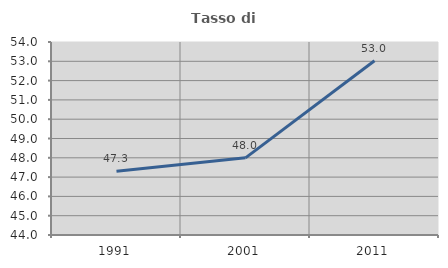
| Category | Tasso di occupazione   |
|---|---|
| 1991.0 | 47.304 |
| 2001.0 | 47.997 |
| 2011.0 | 53.027 |